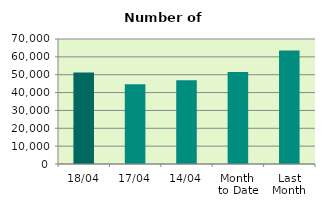
| Category | Series 0 |
|---|---|
| 18/04 | 51294 |
| 17/04 | 44698 |
| 14/04 | 46858 |
| Month 
to Date | 51540.8 |
| Last
Month | 63497.391 |